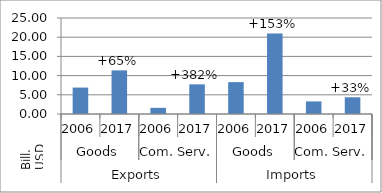
| Category | Trade flows |
|---|---|
| 0 | 6.883 |
| 1 | 11.36 |
| 2 | 1.604 |
| 3 | 7.726 |
| 4 | 8.305 |
| 5 | 20.98 |
| 6 | 3.281 |
| 7 | 4.353 |